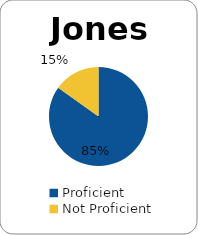
| Category | Series 0 |
|---|---|
| Proficient | 0.848 |
| Not Proficient | 0.152 |